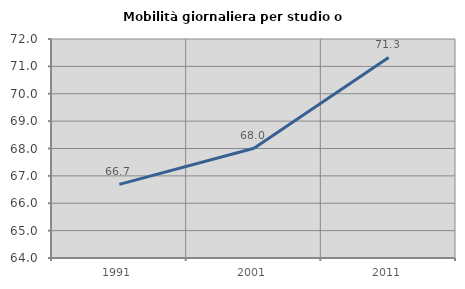
| Category | Mobilità giornaliera per studio o lavoro |
|---|---|
| 1991.0 | 66.689 |
| 2001.0 | 68.008 |
| 2011.0 | 71.328 |